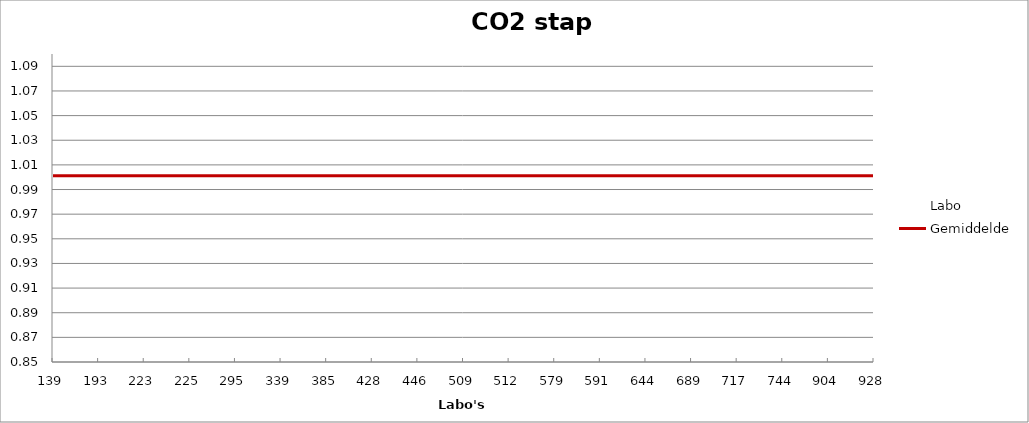
| Category | Labo | Gemiddelde |
|---|---|---|
| 139.0 | 0.98 | 1.001 |
| 193.0 | 0.966 | 1.001 |
| 223.0 | 0.996 | 1.001 |
| 225.0 | 1.023 | 1.001 |
| 295.0 | 1.007 | 1.001 |
| 339.0 | 0.996 | 1.001 |
| 385.0 | 0.993 | 1.001 |
| 428.0 | 1.002 | 1.001 |
| 446.0 | 0.986 | 1.001 |
| 509.0 | 1.009 | 1.001 |
| 512.0 | 1 | 1.001 |
| 579.0 | 1.002 | 1.001 |
| 591.0 | 1.075 | 1.001 |
| 644.0 | 1.08 | 1.001 |
| 689.0 | 0.993 | 1.001 |
| 717.0 | 0.966 | 1.001 |
| 744.0 | 0.991 | 1.001 |
| 904.0 | 1.039 | 1.001 |
| 928.0 | 1.002 | 1.001 |